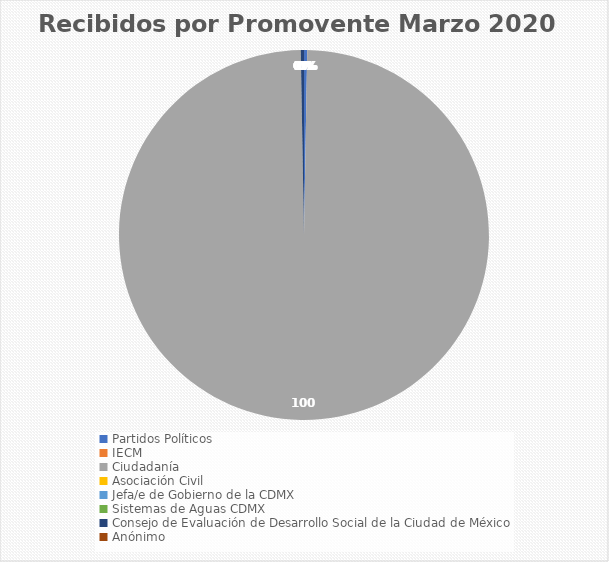
| Category | Recibidos por Promovente Marzo |
|---|---|
| Partidos Políticos | 1 |
| IECM | 0 |
| Ciudadanía  | 355 |
| Asociación Civil | 0 |
| Jefa/e de Gobierno de la CDMX | 0 |
| Sistemas de Aguas CDMX | 0 |
| Consejo de Evaluación de Desarrollo Social de la Ciudad de México | 1 |
| Anónimo | 0 |